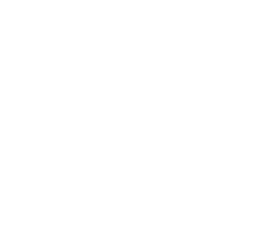
| Category | Uitkomst per thema | Veerkracht |
|---|---|---|
| Stressreductie | 0 | 0 |
| Sociale relaties | 0 | 0 |
| Beweging | 0 | 0 |
| Biologische Voeding | 0 | 0 |
| Zingeving | 0 | 0 |
| Werktevredenheid | 0 | 0 |